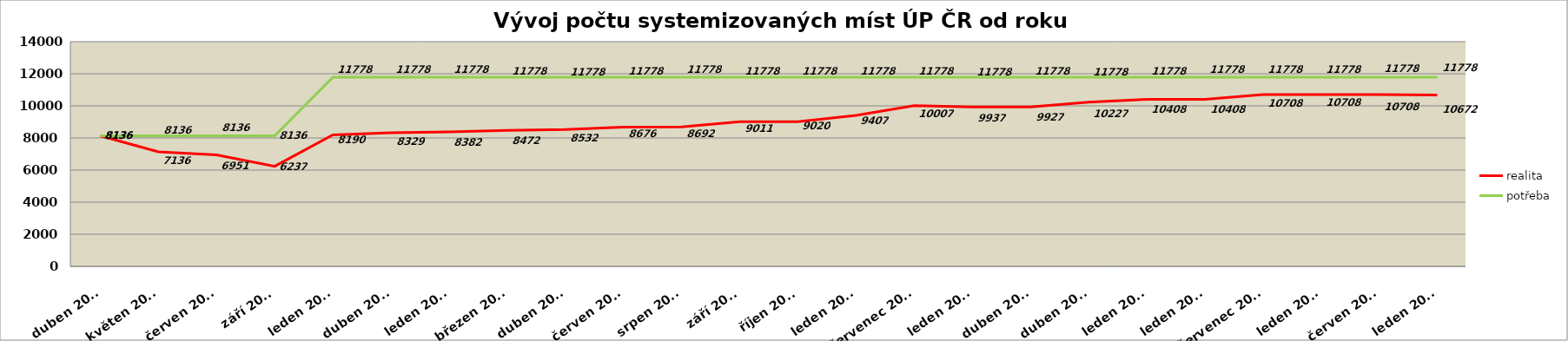
| Category | realita | potřeba |
|---|---|---|
| duben 2011 | 8136 | 8136 |
| květen 2011 | 7136 | 8136 |
| červen 2011 | 6951 | 8136 |
| září 2011 | 6237 | 8136 |
| leden 2012 | 8190 | 11778 |
| duben 2012 | 8329 | 11778 |
| leden 2013 | 8382 | 11778 |
| březen 2013 | 8472 | 11778 |
| duben 2013 | 8532 | 11778 |
| červen 2013 | 8676 | 11778 |
| srpen 2013 | 8692 | 11778 |
| září 2013 | 9011 | 11778 |
| říjen 2013 | 9020 | 11778 |
| leden 2014 | 9407 | 11778 |
| červenec 2014 | 10007 | 11778 |
| leden 2015 | 9937 | 11778 |
| duben 2015 | 9927 | 11778 |
| duben 2015 | 10227 | 11778 |
| leden 2016 | 10408 | 11778 |
| leden 2017 | 10408 | 11778 |
| červenec 2017 | 10708 | 11778 |
| leden 2018 | 10708 | 11778 |
| červen 2018 | 10708 | 11778 |
| leden 2019 | 10672 | 11778 |